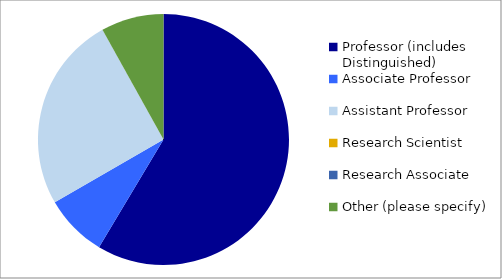
| Category | Series 0 |
|---|---|
| Professor (includes Distinguished) | 0.58 |
| Associate Professor | 0.08 |
| Assistant Professor | 0.25 |
| Research Scientist | 0 |
| Research Associate | 0 |
| Other (please specify) | 0.08 |